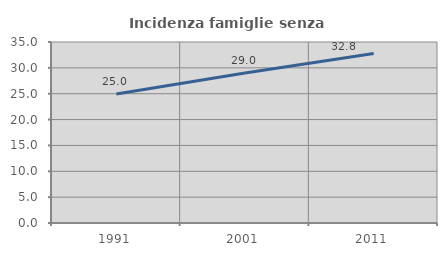
| Category | Incidenza famiglie senza nuclei |
|---|---|
| 1991.0 | 24.954 |
| 2001.0 | 29.019 |
| 2011.0 | 32.77 |